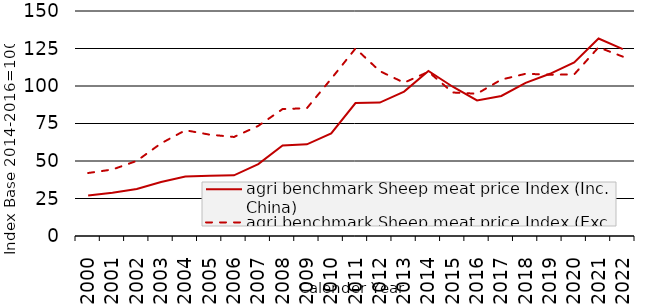
| Category | agri benchmark Sheep meat price Index (Inc. China) | agri benchmark Sheep meat price Index (Exc. China) |
|---|---|---|
| 2000.0 | 26.966 | 42.001 |
| 2001.0 | 28.875 | 44.332 |
| 2002.0 | 31.331 | 50.076 |
| 2003.0 | 36.051 | 61.757 |
| 2004.0 | 39.71 | 70.507 |
| 2005.0 | 40.13 | 67.564 |
| 2006.0 | 40.43 | 66.02 |
| 2007.0 | 47.902 | 73.418 |
| 2008.0 | 60.37 | 84.615 |
| 2009.0 | 61.106 | 85.199 |
| 2010.0 | 68.38 | 104.792 |
| 2011.0 | 88.592 | 125.007 |
| 2012.0 | 88.957 | 109.905 |
| 2013.0 | 96.252 | 102.219 |
| 2014.0 | 110.081 | 109.482 |
| 2015.0 | 99.503 | 95.671 |
| 2016.0 | 90.415 | 94.847 |
| 2017.0 | 93.349 | 104.267 |
| 2018.0 | 102.064 | 108.16 |
| 2019.0 | 108.129 | 107.521 |
| 2020.0 | 115.761 | 107.76 |
| 2021.0 | 131.659 | 125.783 |
| 2022.0 | 124.579 | 119.565 |